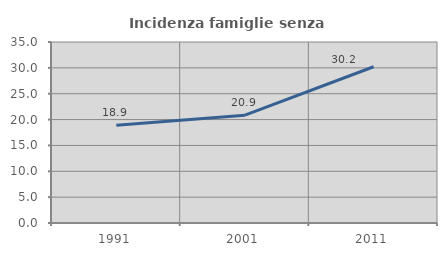
| Category | Incidenza famiglie senza nuclei |
|---|---|
| 1991.0 | 18.888 |
| 2001.0 | 20.856 |
| 2011.0 | 30.212 |